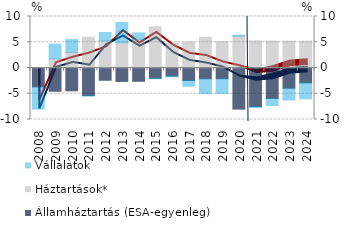
| Category | Államháztartás (ESA-egyenleg) | Háztartások* | Vállalatok |
|---|---|---|---|
| 2008.0 | -3.672 | 0.052 | -4.314 |
| 2009.0 | -4.521 | 1.775 | 2.86 |
| 2010.0 | -4.43 | 3.024 | 2.493 |
| 2011.0 | -5.368 | 5.979 | -0.054 |
| 2012.0 | -2.381 | 5.276 | 1.609 |
| 2013.0 | -2.611 | 4.897 | 3.936 |
| 2014.0 | -2.581 | 5.501 | 1.31 |
| 2015.0 | -2.003 | 8.002 | -0.1 |
| 2016.0 | -1.573 | 4.768 | -0.143 |
| 2017.0 | -2.428 | 5.026 | -1.128 |
| 2018.0 | -2.094 | 5.936 | -2.873 |
| 2019.0 | -2.078 | 5.088 | -2.853 |
| 2020.0 | -7.983 | 6.168 | 0.219 |
| 2021.0 | -7.501 | 5.285 | -0.151 |
| 2022.0 | -5.926 | 5.222 | -1.361 |
| 2023.0 | -3.927 | 5.21 | -2.288 |
| 2024.0 | -2.881 | 5.216 | -3.104 |